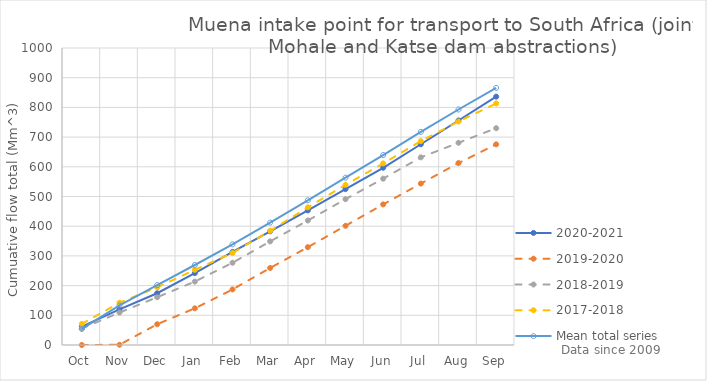
| Category | 2020-2021 | 2019-2020 | 2018-2019 | 2017-2018 | Mean total series |
|---|---|---|---|---|---|
| Oct | 62.004 | 0 | 55.63 | 71.111 | 54.035 |
| Nov | 120.144 | 0.838 | 109.263 | 142.342 | 133.111 |
| Dec | 174.289 | 69.927 | 160.822 | 194.176 | 201.76 |
| Jan | 242.038 | 123.491 | 213.437 | 253.2 | 269.361 |
| Feb | 313.377 | 187.05 | 276.817 | 309.849 | 339.072 |
| Mar | 382.842 | 259.362 | 348.859 | 384.46 | 412.163 |
| Apr | 453.114 | 329.353 | 419.152 | 463.507 | 487.255 |
| May | 524.88 | 401.392 | 490.982 | 539.28 | 563.302 |
| Jun | 596.687 | 473.375 | 560.025 | 611.352 | 639.48 |
| Jul | 675.878 | 543.52 | 631.851 | 686.534 | 717.6 |
| Aug | 755.92 | 612.624 | 680.866 | 752.538 | 792.93 |
| Sep | 836.153 | 675.63 | 730.058 | 813.274 | 865.818 |